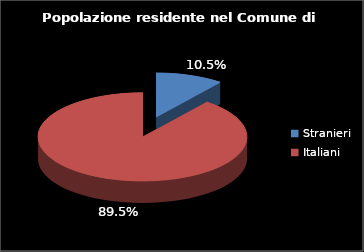
| Category | Series 0 |
|---|---|
| Stranieri | 2185 |
| Italiani | 18623 |